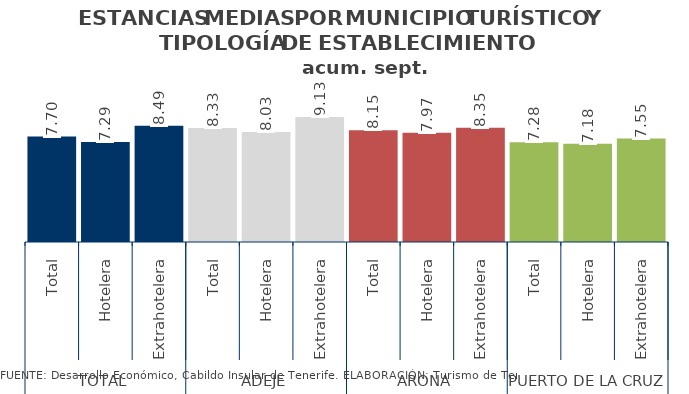
| Category | Series 2 |
|---|---|
| 0 | 7.699 |
| 1 | 7.291 |
| 2 | 8.488 |
| 3 | 8.329 |
| 4 | 8.025 |
| 5 | 9.126 |
| 6 | 8.153 |
| 7 | 7.966 |
| 8 | 8.347 |
| 9 | 7.276 |
| 10 | 7.176 |
| 11 | 7.548 |